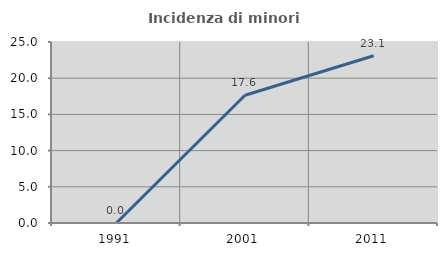
| Category | Incidenza di minori stranieri |
|---|---|
| 1991.0 | 0 |
| 2001.0 | 17.647 |
| 2011.0 | 23.108 |